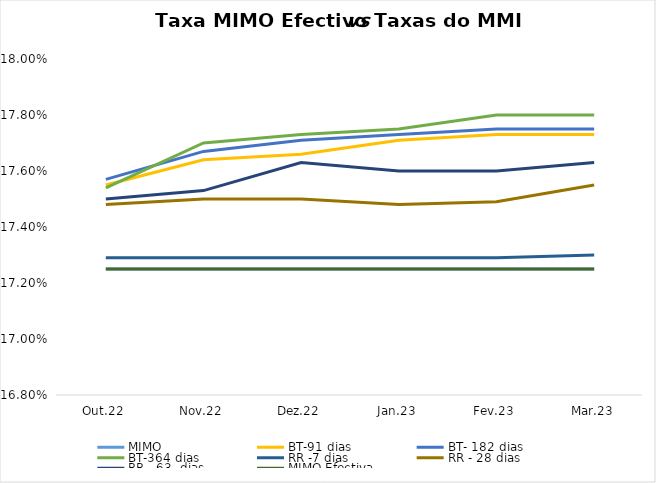
| Category | MIMO | BT-91 dias | BT- 182 dias | BT-364 dias | RR -7 dias | RR - 28 dias | RR - 63  dias | MIMO Efectiva |
|---|---|---|---|---|---|---|---|---|
| Out.22 | 0.172 | 0.176 | 0.176 | 0.175 | 0.173 | 0.175 | 0.175 | 0.172 |
| Nov.22 | 0.172 | 0.176 | 0.177 | 0.177 | 0.173 | 0.175 | 0.175 | 0.172 |
| Dez.22 | 0.172 | 0.177 | 0.177 | 0.177 | 0.173 | 0.175 | 0.176 | 0.172 |
| Jan.23 | 0.172 | 0.177 | 0.177 | 0.178 | 0.173 | 0.175 | 0.176 | 0.172 |
| Fev.23 | 0.172 | 0.177 | 0.178 | 0.178 | 0.173 | 0.175 | 0.176 | 0.172 |
| Mar.23 | 0.172 | 0.177 | 0.178 | 0.178 | 0.173 | 0.176 | 0.176 | 0.172 |